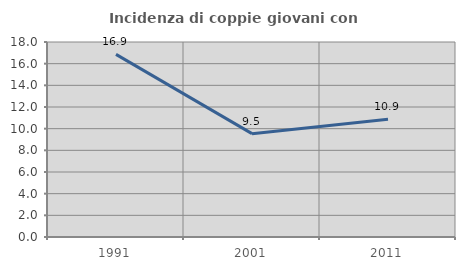
| Category | Incidenza di coppie giovani con figli |
|---|---|
| 1991.0 | 16.862 |
| 2001.0 | 9.538 |
| 2011.0 | 10.878 |